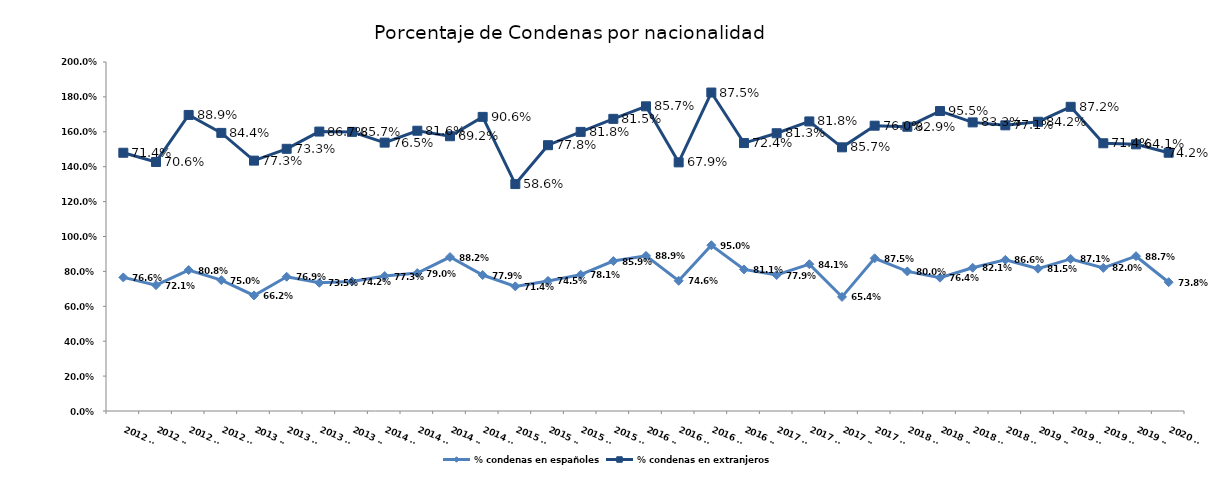
| Category | % condenas en españoles | % condenas en extranjeros |
|---|---|---|
| 2012 T1 | 0.766 | 0.714 |
| 2012 T2 | 0.721 | 0.706 |
| 2012 T3 | 0.808 | 0.889 |
| 2012 T4 | 0.75 | 0.844 |
| 2013 T1 | 0.662 | 0.773 |
| 2013 T2 | 0.769 | 0.733 |
| 2013 T3 | 0.735 | 0.867 |
| 2013 T4 | 0.742 | 0.857 |
| 2014 T1 | 0.773 | 0.765 |
| 2014 T2 | 0.79 | 0.816 |
| 2014 T3 | 0.882 | 0.692 |
| 2014 T4 | 0.779 | 0.906 |
| 2015 T1 | 0.714 | 0.586 |
| 2015 T2 | 0.745 | 0.778 |
| 2015 T3 | 0.781 | 0.818 |
| 2015 T4 | 0.859 | 0.815 |
| 2016 T1 | 0.889 | 0.857 |
| 2016 T2 | 0.746 | 0.679 |
| 2016 T3 | 0.95 | 0.875 |
| 2016 T4 | 0.811 | 0.724 |
| 2017 T1 | 0.779 | 0.812 |
| 2017 T2 | 0.841 | 0.818 |
| 2017 T3 | 0.654 | 0.857 |
| 2017 T4 | 0.875 | 0.76 |
| 2018 T1 | 0.8 | 0.829 |
| 2018 T2 | 0.764 | 0.955 |
| 2018 T3 | 0.821 | 0.833 |
| 2018 T4 | 0.866 | 0.771 |
| 2019 T1 | 0.815 | 0.842 |
| 2019 T2 | 0.871 | 0.872 |
| 2019 T3 | 0.82 | 0.714 |
| 2019 T4 | 0.887 | 0.641 |
| 2020 T1 | 0.738 | 0.742 |